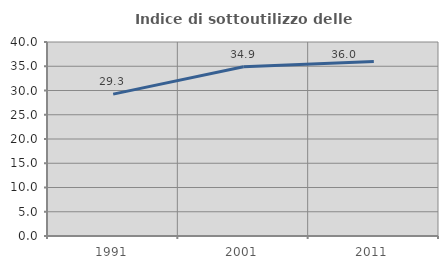
| Category | Indice di sottoutilizzo delle abitazioni  |
|---|---|
| 1991.0 | 29.257 |
| 2001.0 | 34.91 |
| 2011.0 | 36.005 |